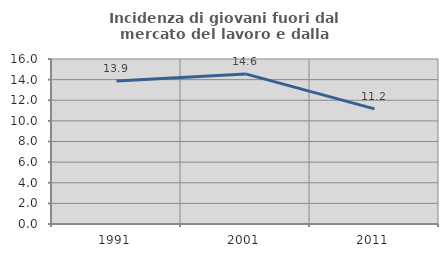
| Category | Incidenza di giovani fuori dal mercato del lavoro e dalla formazione  |
|---|---|
| 1991.0 | 13.857 |
| 2001.0 | 14.554 |
| 2011.0 | 11.168 |